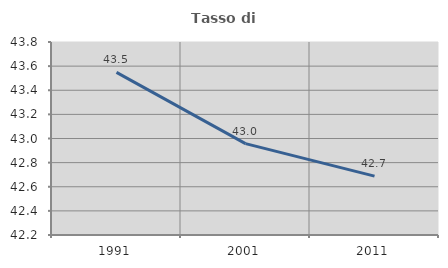
| Category | Tasso di occupazione   |
|---|---|
| 1991.0 | 43.548 |
| 2001.0 | 42.958 |
| 2011.0 | 42.688 |